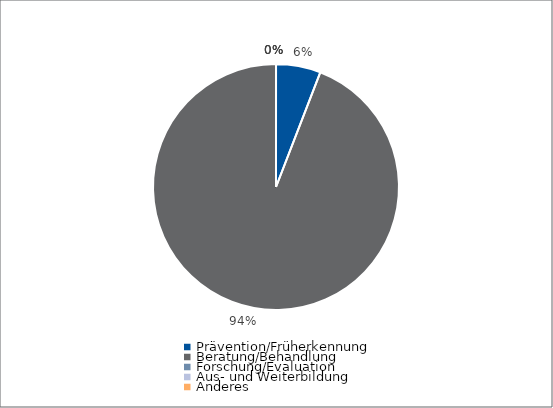
| Category | Series 0 |
|---|---|
| Prävention/Früherkennung | 3960 |
| Beratung/Behandlung | 63540 |
| Forschung/Evaluation | 0 |
| Aus- und Weiterbildung | 0 |
| Anderes | 0 |